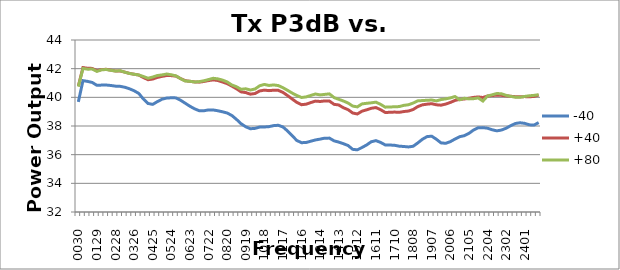
| Category | -40 | +40 | +80 |
|---|---|---|---|
| 30.0 | 39.68 | 40.776 | 40.748 |
| 54.7 | 41.166 | 42.076 | 42.012 |
| 79.4 | 41.112 | 42.028 | 41.965 |
| 104.10000000000001 | 41.036 | 42.019 | 41.971 |
| 128.8 | 40.837 | 41.859 | 41.809 |
| 153.5 | 40.853 | 41.939 | 41.92 |
| 178.2 | 40.859 | 41.956 | 41.94 |
| 202.89999999999998 | 40.826 | 41.895 | 41.882 |
| 227.59999999999997 | 40.78 | 41.838 | 41.833 |
| 252.29999999999995 | 40.768 | 41.839 | 41.86 |
| 276.99999999999994 | 40.702 | 41.759 | 41.751 |
| 301.69999999999993 | 40.597 | 41.67 | 41.667 |
| 326.3999999999999 | 40.458 | 41.613 | 41.608 |
| 351.0999999999999 | 40.273 | 41.554 | 41.561 |
| 375.7999999999999 | 39.88 | 41.379 | 41.453 |
| 400.4999999999999 | 39.57 | 41.23 | 41.331 |
| 425.1999999999999 | 39.51 | 41.276 | 41.416 |
| 449.89999999999986 | 39.7 | 41.392 | 41.521 |
| 474.59999999999985 | 39.868 | 41.461 | 41.564 |
| 499.29999999999984 | 39.95 | 41.522 | 41.626 |
| 523.9999999999999 | 39.968 | 41.514 | 41.574 |
| 548.6999999999999 | 39.961 | 41.478 | 41.498 |
| 573.4 | 39.794 | 41.307 | 41.3 |
| 598.1 | 39.587 | 41.162 | 41.137 |
| 622.8000000000001 | 39.378 | 41.118 | 41.121 |
| 647.5000000000001 | 39.199 | 41.077 | 41.066 |
| 672.2000000000002 | 39.065 | 41.059 | 41.097 |
| 696.9000000000002 | 39.064 | 41.106 | 41.154 |
| 721.6000000000003 | 39.122 | 41.169 | 41.24 |
| 746.3000000000003 | 39.12 | 41.218 | 41.329 |
| 771.0000000000003 | 39.064 | 41.173 | 41.288 |
| 795.7000000000004 | 38.992 | 41.071 | 41.204 |
| 820.4000000000004 | 38.906 | 40.96 | 41.077 |
| 845.1000000000005 | 38.737 | 40.785 | 40.864 |
| 869.8000000000005 | 38.464 | 40.601 | 40.741 |
| 894.5000000000006 | 38.159 | 40.38 | 40.56 |
| 919.2000000000006 | 37.945 | 40.332 | 40.597 |
| 943.9000000000007 | 37.809 | 40.222 | 40.512 |
| 968.6000000000007 | 37.835 | 40.266 | 40.581 |
| 993.3000000000008 | 37.926 | 40.445 | 40.808 |
| 1018.0000000000008 | 37.931 | 40.503 | 40.901 |
| 1042.7000000000007 | 37.956 | 40.467 | 40.828 |
| 1067.4000000000008 | 38.026 | 40.497 | 40.866 |
| 1092.1000000000008 | 38.052 | 40.488 | 40.821 |
| 1116.8000000000009 | 37.933 | 40.345 | 40.672 |
| 1141.500000000001 | 37.651 | 40.122 | 40.488 |
| 1166.200000000001 | 37.314 | 39.88 | 40.294 |
| 1190.900000000001 | 36.988 | 39.644 | 40.129 |
| 1215.600000000001 | 36.836 | 39.486 | 39.988 |
| 1240.300000000001 | 36.85 | 39.522 | 40.03 |
| 1265.0000000000011 | 36.941 | 39.636 | 40.134 |
| 1289.7000000000012 | 37.027 | 39.737 | 40.234 |
| 1314.4000000000012 | 37.085 | 39.711 | 40.169 |
| 1339.1000000000013 | 37.152 | 39.748 | 40.206 |
| 1363.8000000000013 | 37.154 | 39.74 | 40.24 |
| 1388.5000000000014 | 36.964 | 39.512 | 39.982 |
| 1413.2000000000014 | 36.878 | 39.467 | 39.861 |
| 1437.9000000000015 | 36.766 | 39.276 | 39.746 |
| 1462.6000000000015 | 36.64 | 39.143 | 39.604 |
| 1487.3000000000015 | 36.373 | 38.909 | 39.392 |
| 1512.0000000000016 | 36.336 | 38.838 | 39.332 |
| 1536.7000000000016 | 36.499 | 39.034 | 39.543 |
| 1561.4000000000017 | 36.678 | 39.129 | 39.583 |
| 1586.1000000000017 | 36.901 | 39.237 | 39.617 |
| 1610.8000000000018 | 36.979 | 39.285 | 39.664 |
| 1635.5000000000018 | 36.856 | 39.14 | 39.51 |
| 1660.2000000000019 | 36.68 | 38.944 | 39.315 |
| 1684.900000000002 | 36.672 | 38.954 | 39.326 |
| 1709.600000000002 | 36.655 | 38.972 | 39.342 |
| 1734.300000000002 | 36.591 | 38.954 | 39.354 |
| 1759.000000000002 | 36.571 | 39.009 | 39.441 |
| 1783.700000000002 | 36.539 | 39.045 | 39.483 |
| 1808.4000000000021 | 36.586 | 39.151 | 39.601 |
| 1833.1000000000022 | 36.819 | 39.353 | 39.754 |
| 1857.8000000000022 | 37.075 | 39.476 | 39.776 |
| 1882.5000000000023 | 37.26 | 39.524 | 39.796 |
| 1907.2000000000023 | 37.29 | 39.556 | 39.812 |
| 1931.9000000000024 | 37.076 | 39.479 | 39.752 |
| 1956.6000000000024 | 36.821 | 39.453 | 39.844 |
| 1981.3000000000025 | 36.792 | 39.529 | 39.892 |
| 2006.0000000000025 | 36.908 | 39.643 | 39.957 |
| 2030.7000000000025 | 37.09 | 39.782 | 40.056 |
| 2055.4000000000024 | 37.253 | 39.859 | 39.828 |
| 2080.100000000002 | 37.323 | 39.883 | 39.936 |
| 2104.800000000002 | 37.485 | 39.933 | 39.891 |
| 2129.500000000002 | 37.722 | 39.994 | 39.905 |
| 2154.2000000000016 | 37.88 | 40.028 | 39.961 |
| 2178.9000000000015 | 37.887 | 39.989 | 39.74 |
| 2203.6000000000013 | 37.847 | 40.091 | 40.094 |
| 2228.300000000001 | 37.737 | 40.126 | 40.177 |
| 2253.000000000001 | 37.661 | 40.149 | 40.267 |
| 2277.7000000000007 | 37.718 | 40.138 | 40.248 |
| 2302.4000000000005 | 37.845 | 40.104 | 40.14 |
| 2327.1000000000004 | 38.024 | 40.074 | 40.064 |
| 2351.8 | 38.176 | 40.044 | 40.009 |
| 2376.5 | 38.225 | 40.043 | 40.003 |
| 2401.2 | 38.185 | 40.051 | 40.064 |
| 2425.8999999999996 | 38.081 | 40.037 | 40.109 |
| 2450.5999999999995 | 38.067 | 40.063 | 40.137 |
| 2475.2999999999993 | 38.238 | 40.16 | 40.183 |